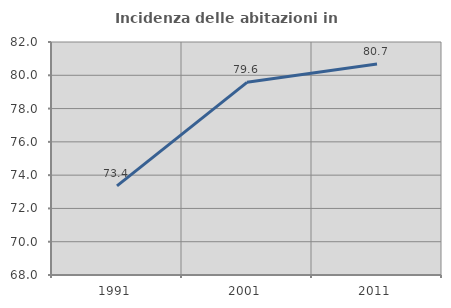
| Category | Incidenza delle abitazioni in proprietà  |
|---|---|
| 1991.0 | 73.358 |
| 2001.0 | 79.577 |
| 2011.0 | 80.681 |